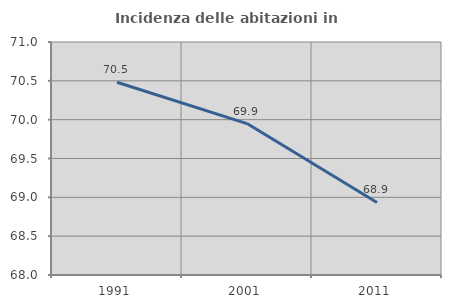
| Category | Incidenza delle abitazioni in proprietà  |
|---|---|
| 1991.0 | 70.481 |
| 2001.0 | 69.95 |
| 2011.0 | 68.934 |